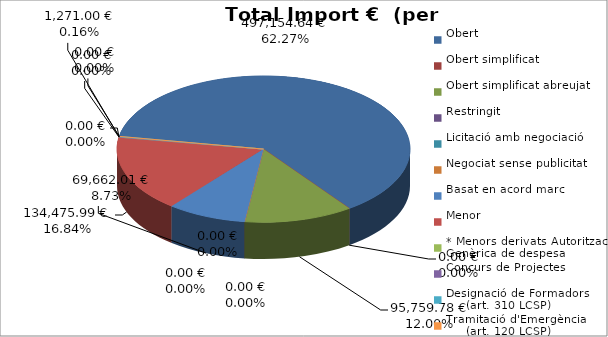
| Category | Total preu
(amb IVA) |
|---|---|
| Obert | 497154.64 |
| Obert simplificat | 0 |
| Obert simplificat abreujat | 95759.78 |
| Restringit | 0 |
| Licitació amb negociació | 0 |
| Negociat sense publicitat | 0 |
| Basat en acord marc | 69662.01 |
| Menor | 134475.99 |
| * Menors derivats Autorització Genèrica de despesa | 0 |
| Concurs de Projectes | 0 |
| Designació de Formadors
     (art. 310 LCSP) | 1271 |
| Tramitació d'Emergència
     (art. 120 LCSP) | 0 |